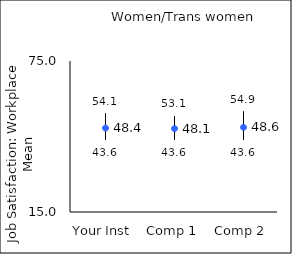
| Category | 25th percentile | 75th percentile | Mean |
|---|---|---|---|
| Your Inst | 43.6 | 54.1 | 48.36 |
| Comp 1 | 43.6 | 53.1 | 48.13 |
| Comp 2 | 43.6 | 54.9 | 48.64 |